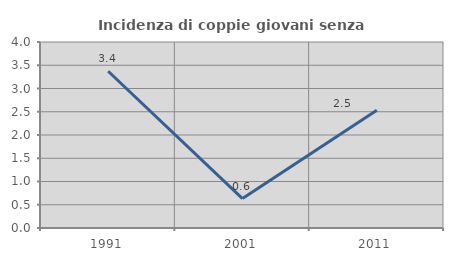
| Category | Incidenza di coppie giovani senza figli |
|---|---|
| 1991.0 | 3.371 |
| 2001.0 | 0.633 |
| 2011.0 | 2.532 |